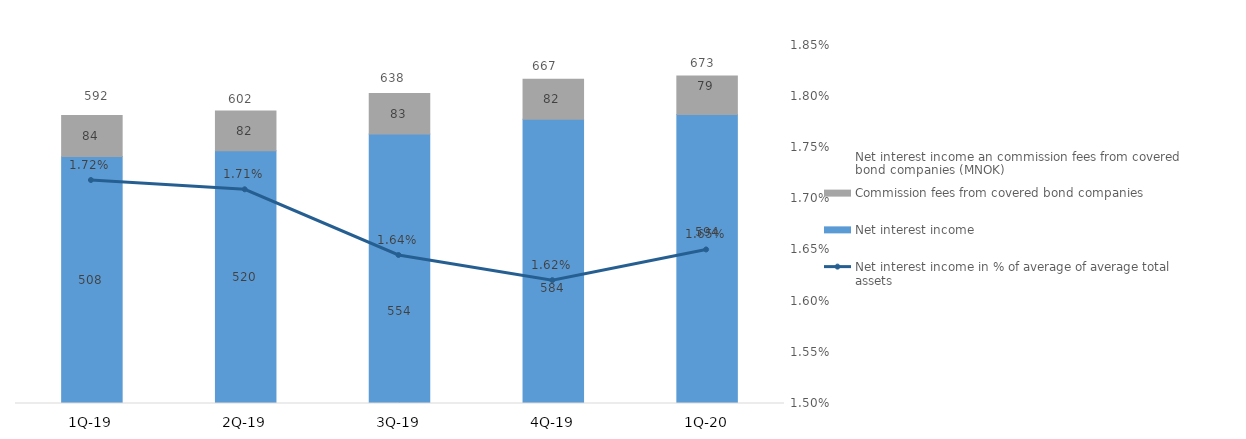
| Category | Net interest income | Commission fees from covered bond companies |
|---|---|---|
| 1Q-20 | 594.469 | 78.983 |
| 4Q-19 | 584.355 | 82.264 |
| 3Q-19 | 554.269 | 83.345 |
| 2Q-19 | 519.574 | 82.097 |
| 1Q-19 | 508 | 84.154 |